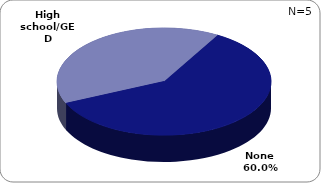
| Category | Series 0 |
|---|---|
| None | 0.6 |
| High school/GED | 0.4 |